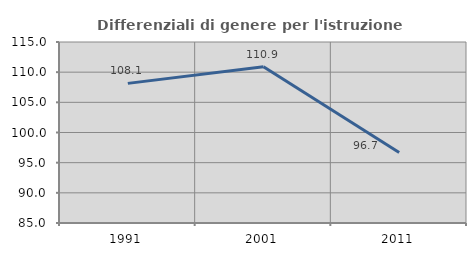
| Category | Differenziali di genere per l'istruzione superiore |
|---|---|
| 1991.0 | 108.144 |
| 2001.0 | 110.887 |
| 2011.0 | 96.69 |